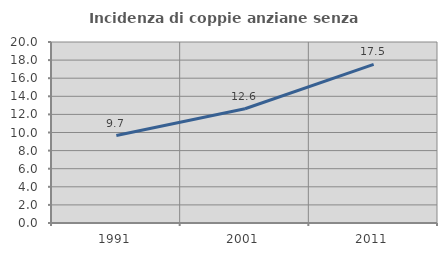
| Category | Incidenza di coppie anziane senza figli  |
|---|---|
| 1991.0 | 9.668 |
| 2001.0 | 12.628 |
| 2011.0 | 17.521 |